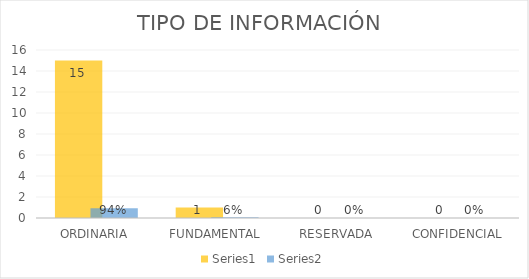
| Category | Series 3 | Series 4 |
|---|---|---|
| ORDINARIA | 15 | 0.938 |
| FUNDAMENTAL | 1 | 0.062 |
| RESERVADA | 0 | 0 |
| CONFIDENCIAL | 0 | 0 |